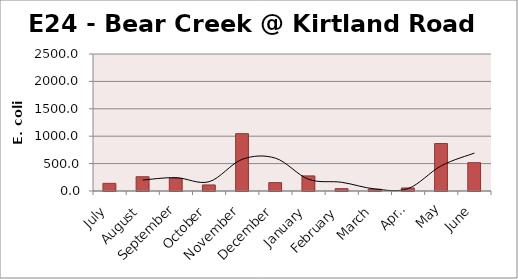
| Category | E. coli MPN |
|---|---|
| July | 139.6 |
| August | 260.2 |
| September | 228.2 |
| October | 110.6 |
| November | 1046.2 |
| December | 152.9 |
| January | 275.5 |
| February | 42.2 |
| March | 32.3 |
| April | 55.4 |
| May | 866.4 |
| June | 517.2 |